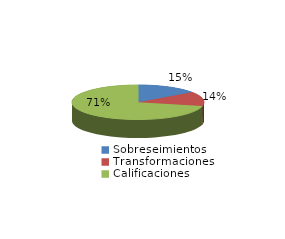
| Category | Series 0 |
|---|---|
| Sobreseimientos | 767 |
| Transformaciones | 686 |
| Calificaciones | 3628 |